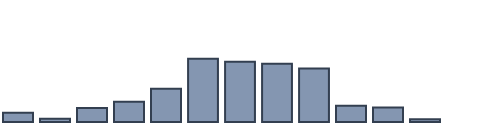
| Category | Series 0 |
|---|---|
| 0 | 2.683 |
| 1 | 0.897 |
| 2 | 3.988 |
| 3 | 5.843 |
| 4 | 9.512 |
| 5 | 18.157 |
| 6 | 17.256 |
| 7 | 16.701 |
| 8 | 15.337 |
| 9 | 4.635 |
| 10 | 4.178 |
| 11 | 0.814 |
| 12 | 0 |